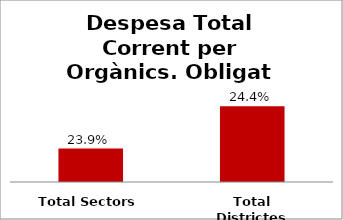
| Category | Series 0 |
|---|---|
| Total Sectors | 0.239 |
| Total Districtes | 0.244 |